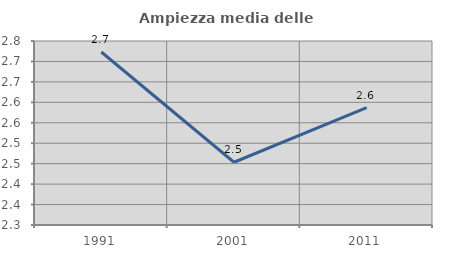
| Category | Ampiezza media delle famiglie |
|---|---|
| 1991.0 | 2.723 |
| 2001.0 | 2.453 |
| 2011.0 | 2.587 |